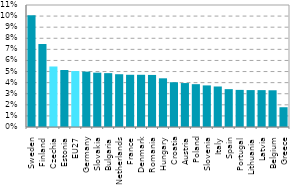
| Category | Series 0 |
|---|---|
| Sweden | 0.101 |
| Finland | 0.075 |
| Czechia | 0.055 |
| Estonia | 0.051 |
| EU27 | 0.05 |
| Germany | 0.05 |
| Slovakia | 0.049 |
| Bulgaria | 0.049 |
| Netherlands | 0.048 |
| France | 0.047 |
| Denmark | 0.047 |
| Romania | 0.047 |
| Hungary | 0.044 |
| Croatia | 0.04 |
| Austria | 0.04 |
| Poland | 0.039 |
| Slovenia | 0.037 |
| Italy | 0.037 |
| Spain | 0.034 |
| Portugal | 0.033 |
| Lithuania | 0.033 |
| Latvia | 0.033 |
| Belgium | 0.033 |
| Greece | 0.018 |